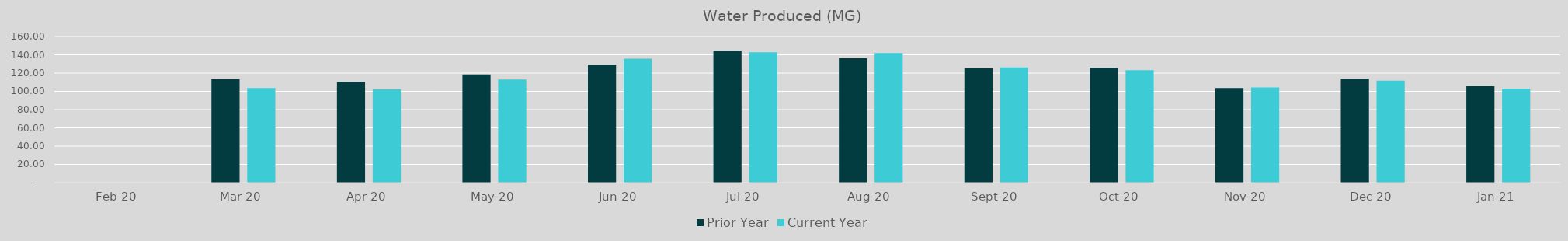
| Category | Prior Year | Current Year |
|---|---|---|
| 2020-02-01 | 0 | 0 |
| 2020-03-01 | 113.435 | 103.589 |
| 2020-04-01 | 110.378 | 102.234 |
| 2020-05-01 | 118.45 | 112.97 |
| 2020-06-01 | 129.166 | 135.774 |
| 2020-07-01 | 144.406 | 142.69 |
| 2020-08-01 | 136.158 | 141.835 |
| 2020-09-01 | 125.367 | 126.166 |
| 2020-10-01 | 125.83 | 123.18 |
| 2020-11-01 | 103.57 | 104.24 |
| 2020-12-01 | 113.6 | 111.67 |
| 2021-01-01 | 105.752 | 103.01 |